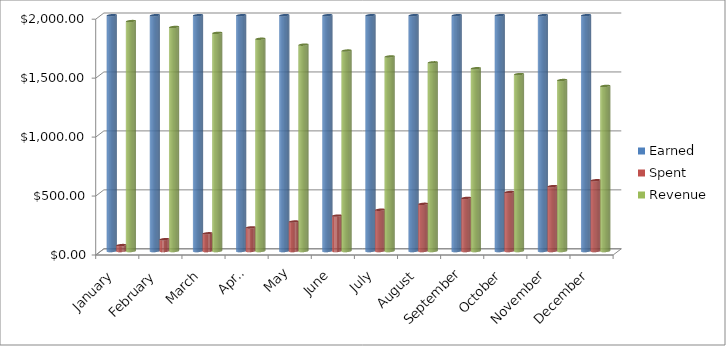
| Category | Earned | Spent | Revenue |
|---|---|---|---|
| January | 2000 | 50 | 1950 |
| February | 2000 | 100 | 1900 |
| March | 2000 | 150 | 1850 |
| April | 2000 | 200 | 1800 |
| May | 2000 | 250 | 1750 |
| June | 2000 | 300 | 1700 |
| July | 2000 | 350 | 1650 |
| August | 2000 | 400 | 1600 |
| September | 2000 | 450 | 1550 |
| October | 2000 | 500 | 1500 |
| November | 2000 | 550 | 1450 |
| December | 2000 | 600 | 1400 |